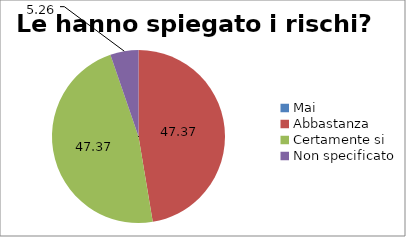
| Category | Le hanno spiegato i rischi? |
|---|---|
| Mai | 0 |
| Abbastanza | 47.368 |
| Certamente si | 47.368 |
| Non specificato | 5.263 |